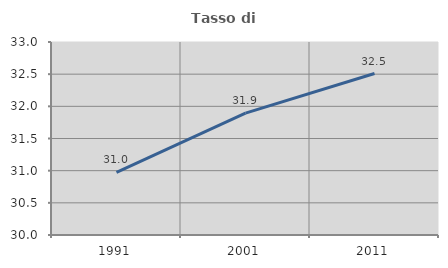
| Category | Tasso di occupazione   |
|---|---|
| 1991.0 | 30.973 |
| 2001.0 | 31.894 |
| 2011.0 | 32.51 |